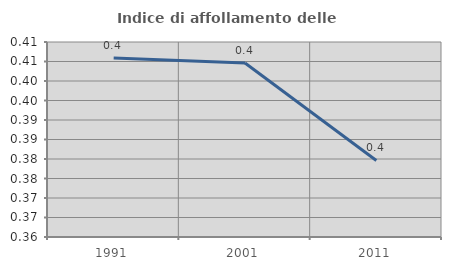
| Category | Indice di affollamento delle abitazioni  |
|---|---|
| 1991.0 | 0.406 |
| 2001.0 | 0.405 |
| 2011.0 | 0.38 |